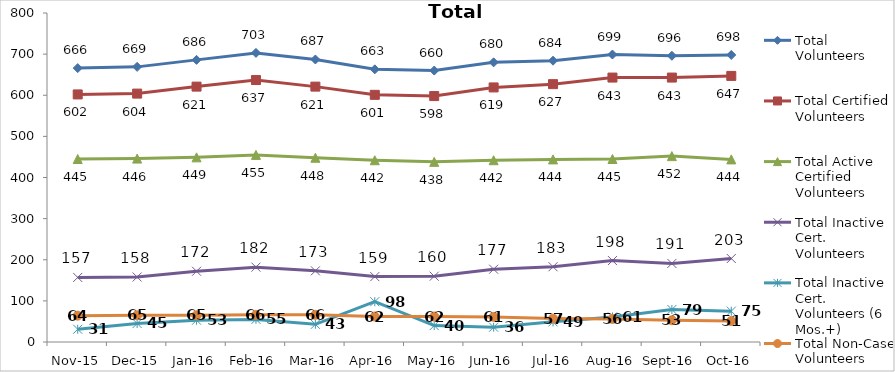
| Category | Total Volunteers | Total Certified Volunteers | Total Active Certified Volunteers | Total Inactive Cert. Volunteers | Total Inactive Cert. Volunteers (6 Mos.+) | Total Non-Case Volunteers |
|---|---|---|---|---|---|---|
| Nov-15 | 666 | 602 | 445 | 157 | 31 | 64 |
| Dec-15 | 669 | 604 | 446 | 158 | 45 | 65 |
| Jan-16 | 686 | 621 | 449 | 172 | 53 | 65 |
| Feb-16 | 703 | 637 | 455 | 182 | 55 | 66 |
| Mar-16 | 687 | 621 | 448 | 173 | 43 | 66 |
| Apr-16 | 663 | 601 | 442 | 159 | 98 | 62 |
| May-16 | 660 | 598 | 438 | 160 | 40 | 62 |
| Jun-16 | 680 | 619 | 442 | 177 | 36 | 61 |
| Jul-16 | 684 | 627 | 444 | 183 | 49 | 57 |
| Aug-16 | 699 | 643 | 445 | 198 | 61 | 56 |
| Sep-16 | 696 | 643 | 452 | 191 | 79 | 53 |
| Oct-16 | 698 | 647 | 444 | 203 | 75 | 51 |